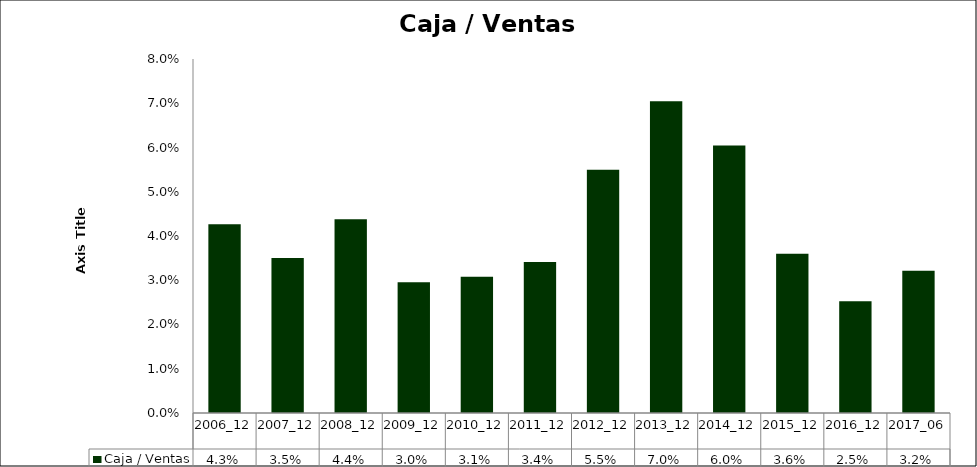
| Category | Caja / Ventas |
|---|---|
| 2006_12 | 0.043 |
| 2007_12 | 0.035 |
| 2008_12 | 0.044 |
| 2009_12 | 0.03 |
| 2010_12 | 0.031 |
| 2011_12 | 0.034 |
| 2012_12 | 0.055 |
| 2013_12 | 0.07 |
| 2014_12 | 0.06 |
| 2015_12 | 0.036 |
| 2016_12 | 0.025 |
| 2017_06 | 0.032 |